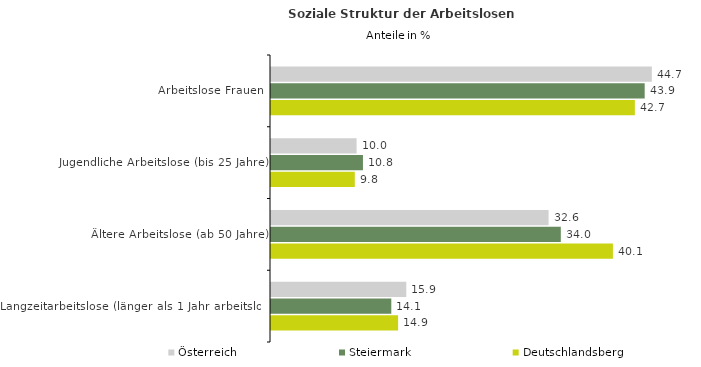
| Category | Österreich | Steiermark | Deutschlandsberg |
|---|---|---|---|
| Arbeitslose Frauen | 44.699 | 43.86 | 42.706 |
| Jugendliche Arbeitslose (bis 25 Jahre) | 10.046 | 10.794 | 9.835 |
| Ältere Arbeitslose (ab 50 Jahre) | 32.578 | 34.015 | 40.132 |
| Langzeitarbeitslose (länger als 1 Jahr arbeitslos) | 15.879 | 14.12 | 14.917 |